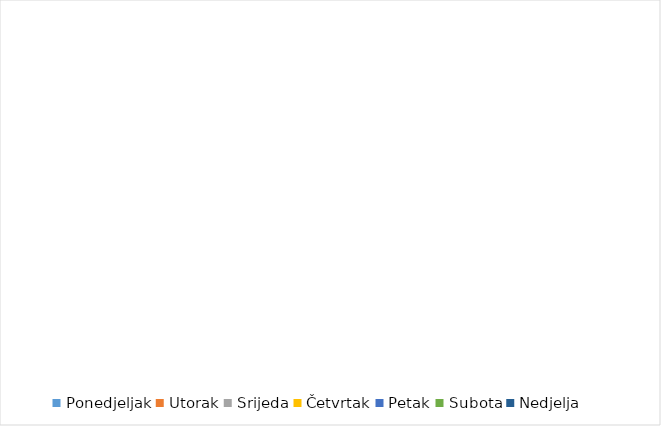
| Category | Series 0 |
|---|---|
| Ponedjeljak | 0 |
| Utorak | 0 |
| Srijeda | 0 |
| Četvrtak | 0 |
| Petak | 0 |
| Subota | 0 |
| Nedjelja | 0 |